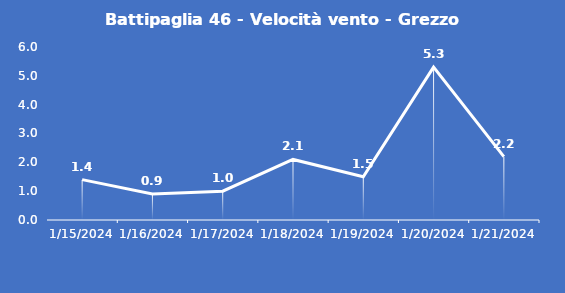
| Category | Battipaglia 46 - Velocità vento - Grezzo (m/s) |
|---|---|
| 1/15/24 | 1.4 |
| 1/16/24 | 0.9 |
| 1/17/24 | 1 |
| 1/18/24 | 2.1 |
| 1/19/24 | 1.5 |
| 1/20/24 | 5.3 |
| 1/21/24 | 2.2 |